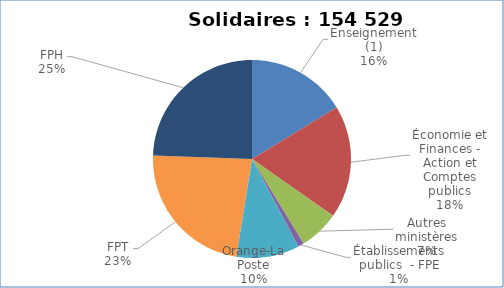
| Category | Nombre de voix |
|---|---|
| Enseignement (1) | 25190 |
| Économie et Finances - Action et Comptes publics | 28470.1 |
| Autres ministères | 10131.3 |
| Établissements publics  - FPE | 1465 |
| Orange-La Poste | 15936 |
| FPT | 35586 |
| FPH | 37750.5 |